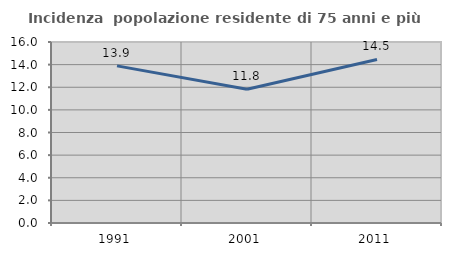
| Category | Incidenza  popolazione residente di 75 anni e più |
|---|---|
| 1991.0 | 13.889 |
| 2001.0 | 11.83 |
| 2011.0 | 14.455 |